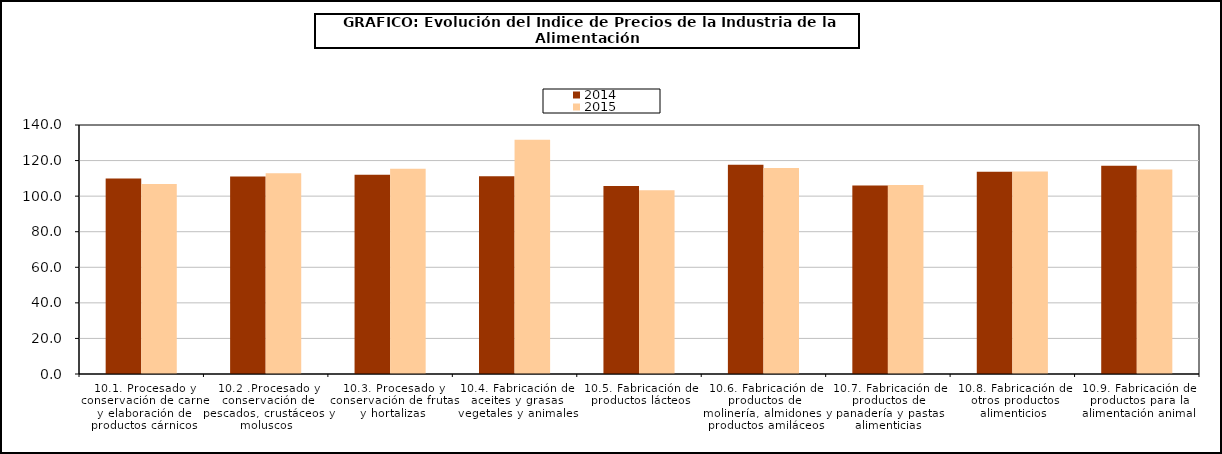
| Category | 2014 | 2015 |
|---|---|---|
| 10.1. Procesado y conservación de carne y elaboración de productos cárnicos | 109.915 | 106.868 |
| 10.2 .Procesado y conservación de pescados, crustáceos y moluscos | 110.983 | 112.821 |
| 10.3. Procesado y conservación de frutas y hortalizas | 112.028 | 115.346 |
| 10.4. Fabricación de aceites y grasas vegetales y animales | 111.15 | 131.774 |
| 10.5. Fabricación de productos lácteos | 105.635 | 103.372 |
| 10.6. Fabricación de productos de molinería, almidones y productos amiláceos | 117.698 | 115.852 |
| 10.7. Fabricación de productos de panadería y pastas alimenticias | 106.04 | 106.31 |
| 10.8. Fabricación de otros productos alimenticios | 113.73 | 113.854 |
| 10.9. Fabricación de productos para la alimentación animal | 117.158 | 115.042 |